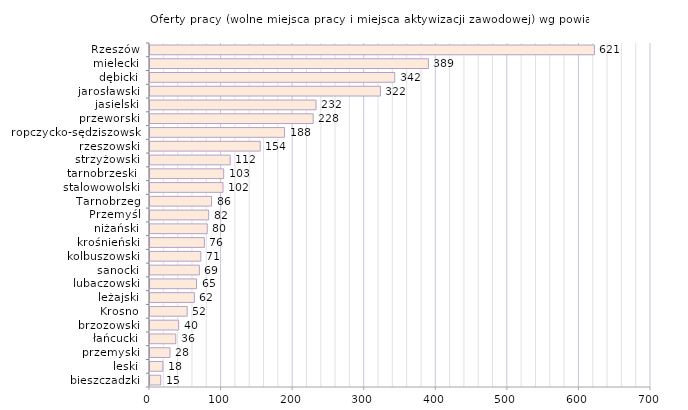
| Category | Oferty pracy (wolne miejsca pracy i miejsca aktywizacji zawodowej) wg powiatów |
|---|---|
| bieszczadzki | 15 |
| leski | 18 |
| przemyski | 28 |
| łańcucki | 36 |
| brzozowski | 40 |
| Krosno | 52 |
| leżajski | 62 |
| lubaczowski | 65 |
| sanocki | 69 |
| kolbuszowski | 71 |
| krośnieński | 76 |
| niżański | 80 |
| Przemyśl | 82 |
| Tarnobrzeg | 86 |
| stalowowolski | 102 |
| tarnobrzeski  | 103 |
| strzyżowski | 112 |
| rzeszowski | 154 |
| ropczycko-sędziszowski | 188 |
| przeworski | 228 |
| jasielski | 232 |
| jarosławski | 322 |
| dębicki | 342 |
| mielecki | 389 |
| Rzeszów | 621 |